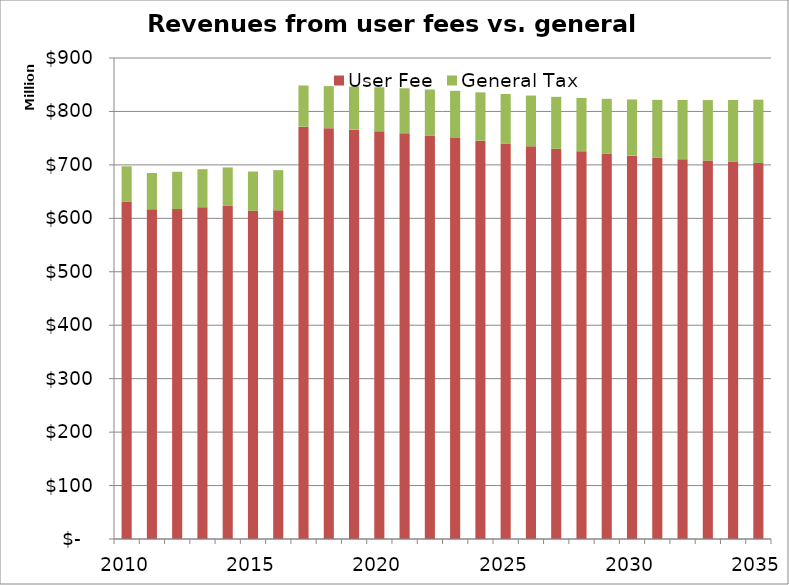
| Category | User Fee | General Tax |
|---|---|---|
| 2010.0 | 631439919.693 | 65911595.244 |
| 2011.0 | 616851004.161 | 67971250.187 |
| 2012.0 | 617318713.068 | 69833844.686 |
| 2013.0 | 620865186.993 | 71109513.838 |
| 2014.0 | 623284405.42 | 71914569.93 |
| 2015.0 | 614101510.105 | 73493004.589 |
| 2016.0 | 614938549.554 | 75262193.72 |
| 2017.0 | 771585464.679 | 76946258.144 |
| 2018.0 | 768723960.787 | 78688037.83 |
| 2019.0 | 765889939.868 | 80558835.465 |
| 2020.0 | 762818935.305 | 82425081.321 |
| 2021.0 | 759117772.985 | 84253586.659 |
| 2022.0 | 754914950.09 | 86174166.952 |
| 2023.0 | 750317965.183 | 88245602.783 |
| 2024.0 | 745307986.251 | 90403305.149 |
| 2025.0 | 739974097.076 | 92631318.32 |
| 2026.0 | 734796969.666 | 94964947.286 |
| 2027.0 | 729931589.329 | 97412776.697 |
| 2028.0 | 725391002.626 | 99893540.892 |
| 2029.0 | 721170493.753 | 102466822.828 |
| 2030.0 | 717305718.228 | 105167117.671 |
| 2031.0 | 713777306.161 | 107919602.274 |
| 2032.0 | 710584249.783 | 110802683.633 |
| 2033.0 | 707989959.497 | 113259332.649 |
| 2034.0 | 705688542.252 | 115782071.441 |
| 2035.0 | 703672769.777 | 118372839.386 |